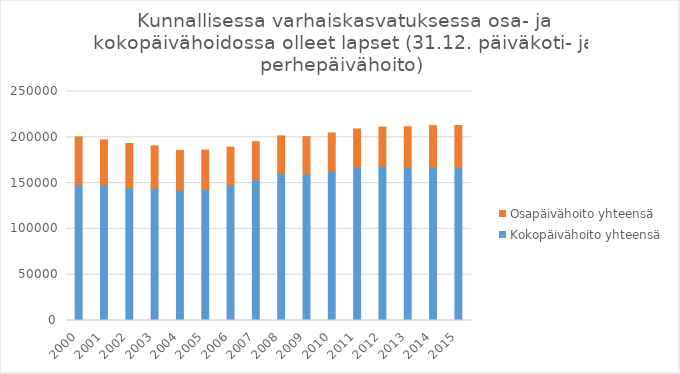
| Category | Kokopäivähoito yhteensä | Osapäivähoito yhteensä |
|---|---|---|
| 2000 | 148046 | 52441 |
| 2001 | 147833 | 49303 |
| 2002 | 144923 | 48327 |
| 2003 | 144434 | 46151 |
| 2004 | 141986 | 43683 |
| 2005 | 143090 | 42963 |
| 2006 | 147650 | 41682 |
| 2007 | 153769 | 41496 |
| 2008 | 160462 | 41088 |
| 2009 | 159718 | 41009 |
| 2010 | 163037 | 41710 |
| 2011 | 167632 | 41466 |
| 2012 | 168014 | 43049 |
| 2013 | 167166 | 44375 |
| 2014 | 167400 | 45290 |
| 2015 | 166927 | 45975 |